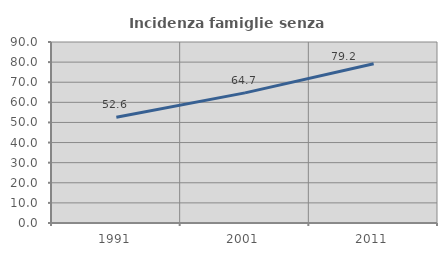
| Category | Incidenza famiglie senza nuclei |
|---|---|
| 1991.0 | 52.632 |
| 2001.0 | 64.706 |
| 2011.0 | 79.221 |